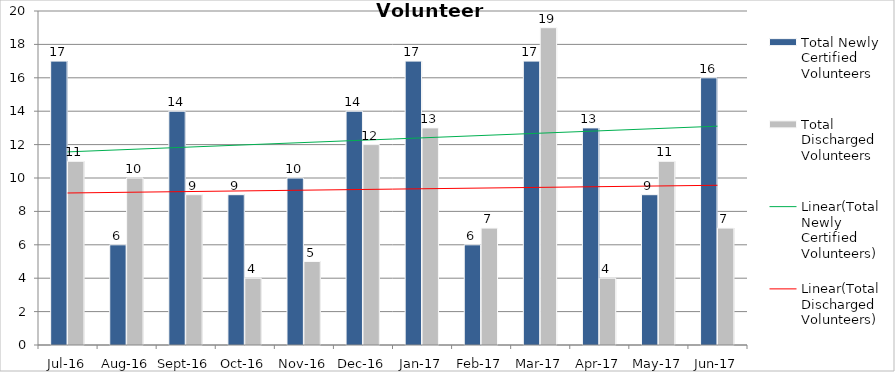
| Category | Total Newly Certified Volunteers | Total Discharged Volunteers |
|---|---|---|
| Jul-16 | 17 | 11 |
| Aug-16 | 6 | 10 |
| Sep-16 | 14 | 9 |
| Oct-16 | 9 | 4 |
| Nov-16 | 10 | 5 |
| Dec-16 | 14 | 12 |
| Jan-17 | 17 | 13 |
| Feb-17 | 6 | 7 |
| Mar-17 | 17 | 19 |
| Apr-17 | 13 | 4 |
| May-17 | 9 | 11 |
| Jun-17 | 16 | 7 |